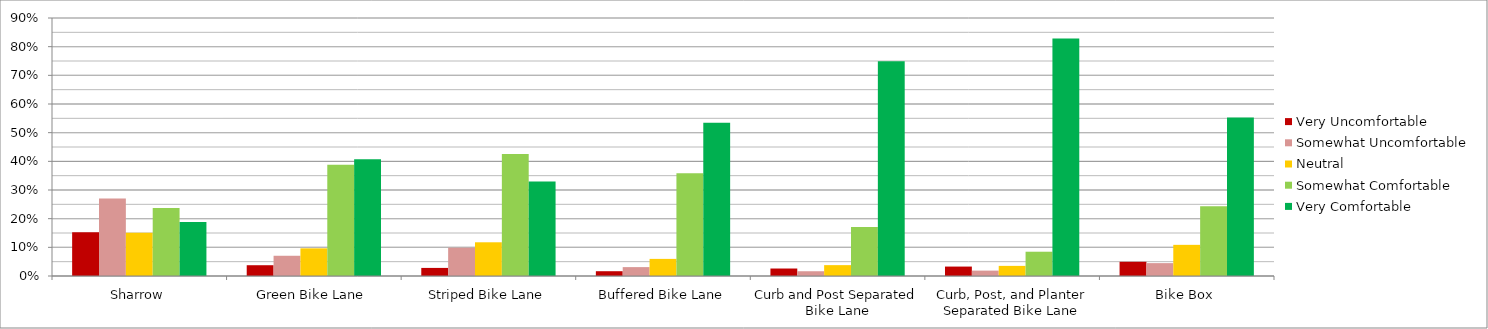
| Category | Very Uncomfortable | Somewhat Uncomfortable | Neutral | Somewhat Comfortable | Very Comfortable |
|---|---|---|---|---|---|
| Sharrow | 0.153 | 0.271 | 0.151 | 0.238 | 0.188 |
| Green Bike Lane | 0.038 | 0.071 | 0.096 | 0.388 | 0.407 |
| Striped Bike Lane | 0.028 | 0.099 | 0.118 | 0.426 | 0.329 |
| Buffered Bike Lane | 0.017 | 0.031 | 0.06 | 0.358 | 0.535 |
| Curb and Post Separated Bike Lane | 0.026 | 0.017 | 0.038 | 0.171 | 0.749 |
| Curb, Post, and Planter Separated Bike Lane | 0.033 | 0.019 | 0.035 | 0.085 | 0.828 |
| Bike Box | 0.05 | 0.045 | 0.109 | 0.244 | 0.553 |